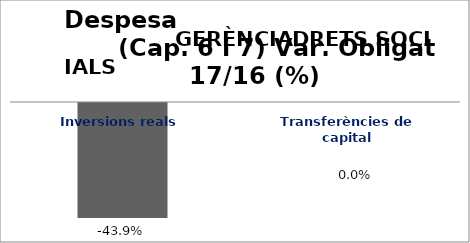
| Category | Series 0 |
|---|---|
| Inversions reals | -0.439 |
| Transferències de capital | 0 |